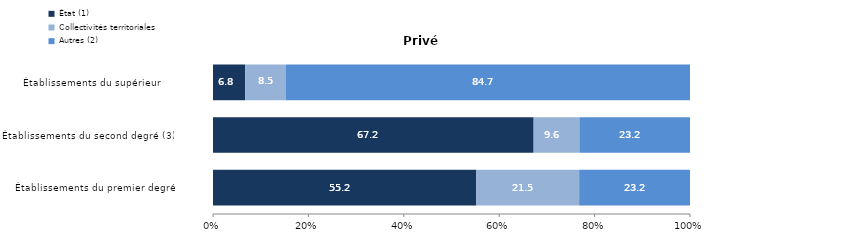
| Category | État (1) | Collectivités territoriales | Autres (2) |
|---|---|---|---|
| Établissements du premier degré | 55.21 | 21.55 | 23.24 |
| Établissements du second degré (3) | 67.224 | 9.592 | 23.184 |
| Établissements du supérieur      | 6.764 | 8.531 | 84.705 |